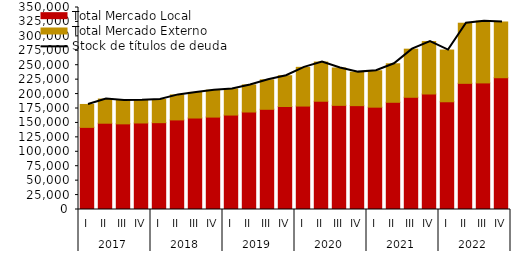
| Category | Total Mercado Local | Total Mercado Externo |
|---|---|---|
| 0 | 142306.926 | 39699.532 |
| 1 | 149501.535 | 41883.972 |
| 2 | 148403.903 | 40410.761 |
| 3 | 149895.839 | 39426.986 |
| 4 | 150450.525 | 40105.384 |
| 5 | 155226.938 | 43340.068 |
| 6 | 158507.222 | 44354.727 |
| 7 | 160112.04 | 46687.209 |
| 8 | 163634.906 | 45192.802 |
| 9 | 168919.452 | 46955.176 |
| 10 | 173632.374 | 51032.848 |
| 11 | 178506.059 | 53267.565 |
| 12 | 179215.88 | 67094.761 |
| 13 | 187583.785 | 67880.928 |
| 14 | 180437.478 | 64798.957 |
| 15 | 179954 | 58077.352 |
| 16 | 177316.36 | 62999.056 |
| 17 | 185768.591 | 66694.532 |
| 18 | 194434.736 | 83358.98 |
| 19 | 200128.909 | 90777.643 |
| 20 | 186666.589 | 89624.836 |
| 21 | 218599.647 | 104166.644 |
| 22 | 219320.556 | 107059.02 |
| 23 | 228315.649 | 96601.061 |